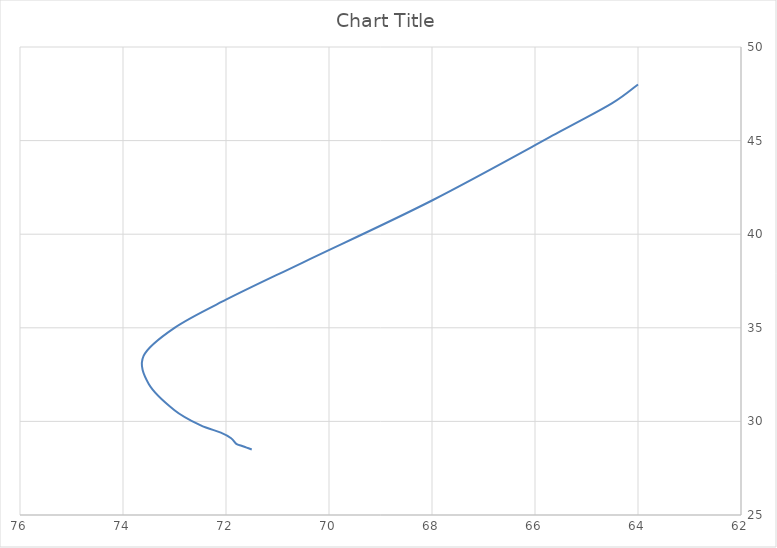
| Category | Series 0 |
|---|---|
| 71.5 | 28.5 |
| 71.6 | 28.6 |
| 71.7 | 28.7 |
| 71.8 | 28.8 |
| 71.9 | 29.1 |
| 72.1 | 29.4 |
| 72.5 | 29.8 |
| 73.0 | 30.6 |
| 73.5 | 32 |
| 73.6 | 33.5 |
| 73.0 | 35 |
| 72.0 | 36.5 |
| 70.5 | 38.5 |
| 68.0 | 41.8 |
| 65.5 | 45.5 |
| 64.5 | 47 |
| 64.0 | 48 |